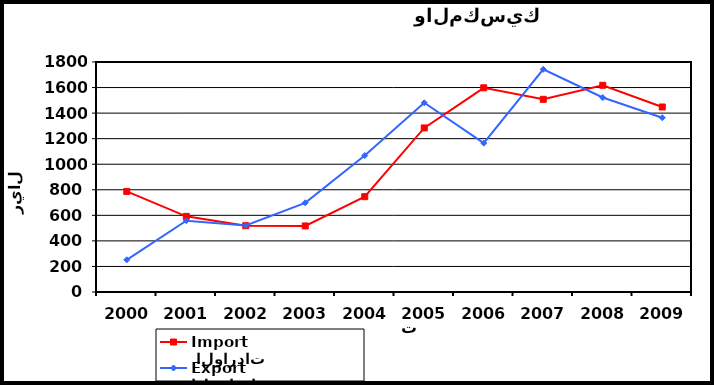
| Category |  الواردات           Import | الصادرات          Export |
|---|---|---|
| 2000.0 | 787 | 252 |
| 2001.0 | 592 | 558 |
| 2002.0 | 519 | 520 |
| 2003.0 | 517 | 698 |
| 2004.0 | 746 | 1068 |
| 2005.0 | 1284 | 1481 |
| 2006.0 | 1598 | 1165 |
| 2007.0 | 1508 | 1743 |
| 2008.0 | 1618 | 1522 |
| 2009.0 | 1448 | 1364 |